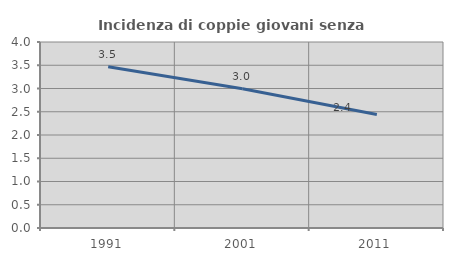
| Category | Incidenza di coppie giovani senza figli |
|---|---|
| 1991.0 | 3.468 |
| 2001.0 | 2.994 |
| 2011.0 | 2.439 |